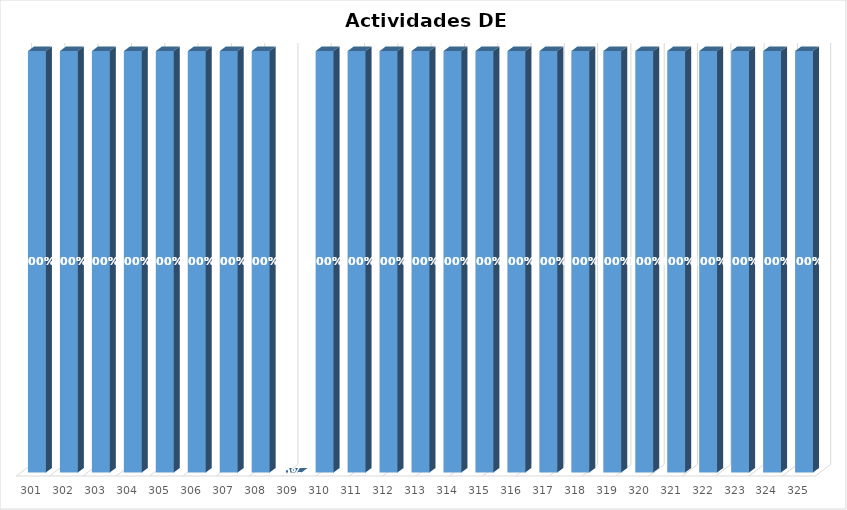
| Category | % Avance |
|---|---|
| 301.0 | 1 |
| 302.0 | 1 |
| 303.0 | 1 |
| 304.0 | 1 |
| 305.0 | 1 |
| 306.0 | 1 |
| 307.0 | 1 |
| 308.0 | 1 |
| 309.0 | 0 |
| 310.0 | 1 |
| 311.0 | 1 |
| 312.0 | 1 |
| 313.0 | 1 |
| 314.0 | 1 |
| 315.0 | 1 |
| 316.0 | 1 |
| 317.0 | 1 |
| 318.0 | 1 |
| 319.0 | 1 |
| 320.0 | 1 |
| 321.0 | 1 |
| 322.0 | 1 |
| 323.0 | 1 |
| 324.0 | 1 |
| 325.0 | 1 |